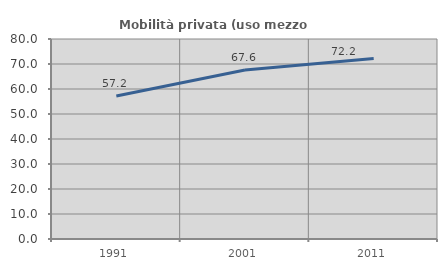
| Category | Mobilità privata (uso mezzo privato) |
|---|---|
| 1991.0 | 57.235 |
| 2001.0 | 67.566 |
| 2011.0 | 72.154 |